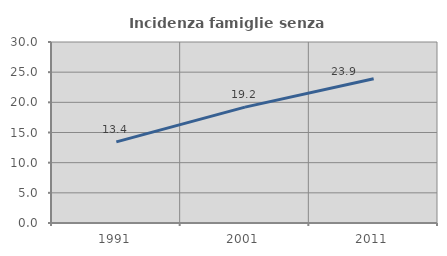
| Category | Incidenza famiglie senza nuclei |
|---|---|
| 1991.0 | 13.44 |
| 2001.0 | 19.204 |
| 2011.0 | 23.908 |